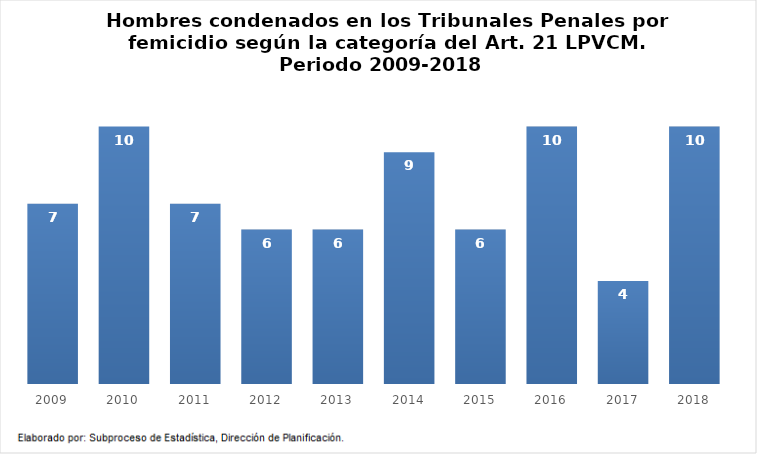
| Category | Series 0 |
|---|---|
| 2009.0 | 7 |
| 2010.0 | 10 |
| 2011.0 | 7 |
| 2012.0 | 6 |
| 2013.0 | 6 |
| 2014.0 | 9 |
| 2015.0 | 6 |
| 2016.0 | 10 |
| 2017.0 | 4 |
| 2018.0 | 10 |